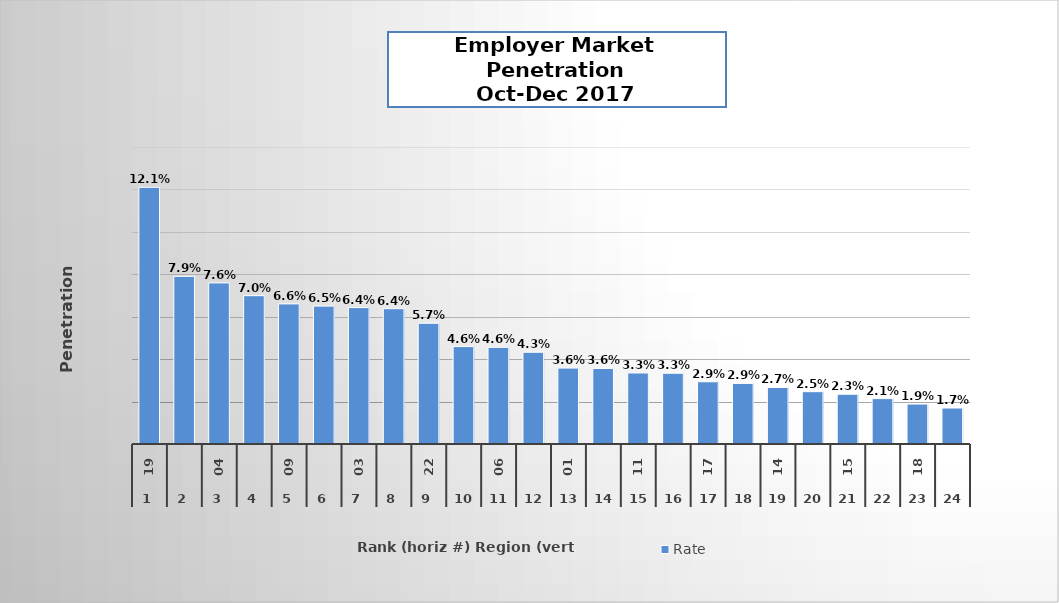
| Category | Rate |
|---|---|
| 0 | 0.121 |
| 1 | 0.079 |
| 2 | 0.076 |
| 3 | 0.07 |
| 4 | 0.066 |
| 5 | 0.065 |
| 6 | 0.064 |
| 7 | 0.064 |
| 8 | 0.057 |
| 9 | 0.046 |
| 10 | 0.046 |
| 11 | 0.043 |
| 12 | 0.036 |
| 13 | 0.036 |
| 14 | 0.033 |
| 15 | 0.033 |
| 16 | 0.029 |
| 17 | 0.029 |
| 18 | 0.027 |
| 19 | 0.025 |
| 20 | 0.023 |
| 21 | 0.021 |
| 22 | 0.019 |
| 23 | 0.017 |